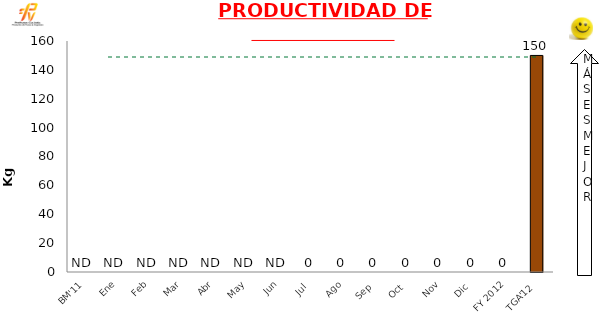
| Category | Mensual |
|---|---|
| BM'11 | 0 |
| Ene | 0 |
| Feb | 0 |
| Mar | 0 |
| Abr | 0 |
| May | 0 |
| Jun | 0 |
| Jul | 0 |
| Ago | 0 |
| Sep | 0 |
| Oct | 0 |
| Nov | 0 |
| Dic | 0 |
| FY 2012 | 0 |
| TGA'12 | 150 |